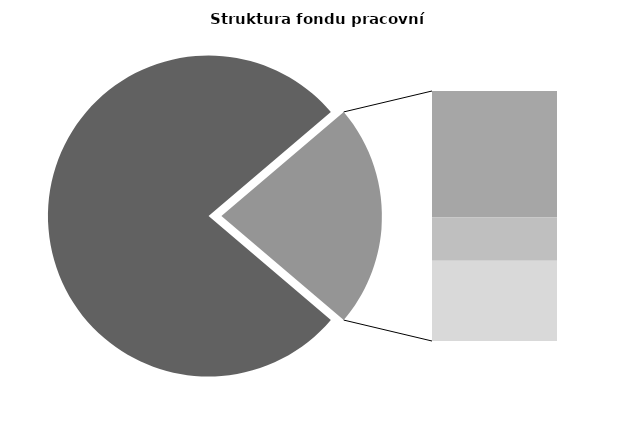
| Category | Series 0 |
|---|---|
| Průměrná měsíční odpracovaná doba bez přesčasu | 134.578 |
| Dovolená | 19.665 |
| Nemoc | 6.771 |
| Jiné | 12.51 |